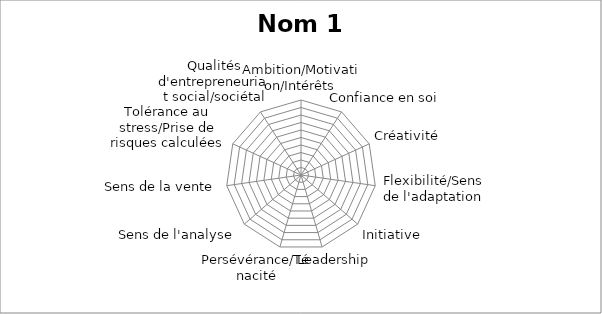
| Category | Series 0 |
|---|---|
| Ambition/Motivation/Intérêts | 0 |
| Confiance en soi | 0 |
| Créativité | 0 |
| Flexibilité/Sens de l'adaptation | 0 |
| Initiative | 0 |
| Leadership  | 0 |
| Persévérance/Ténacité | 0 |
| Sens de l'analyse | 0 |
| Sens de la vente | 0 |
| Tolérance au stress/Prise de risques calculées | 0 |
| Qualités d'entrepreneuriat social/sociétal | 0 |